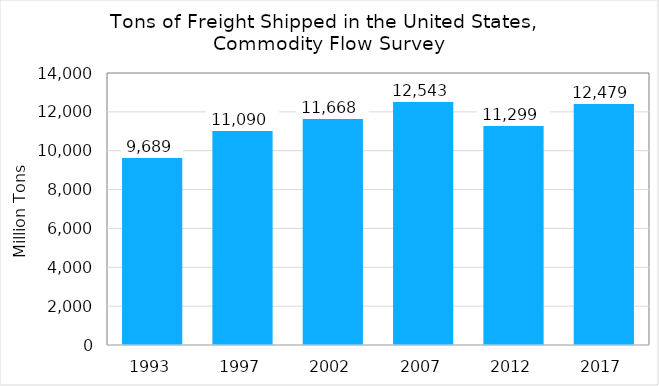
| Category | Tons (millions) |
|---|---|
| 1993.0 | 9688.5 |
| 1997.0 | 11089.7 |
| 2002.0 | 11667.9 |
| 2007.0 | 12543.4 |
| 2012.0 | 11299.4 |
| 2017.0 | 12478.849 |